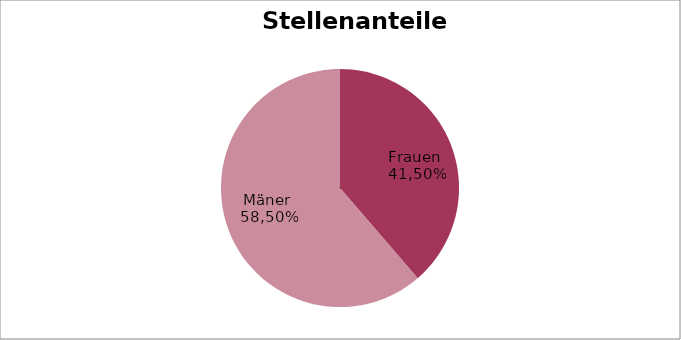
| Category | Series 0 |
|---|---|
| 0 | 0.387 |
| 1 | 0.613 |